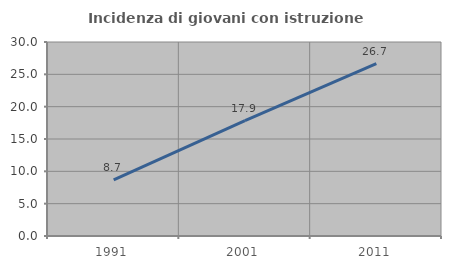
| Category | Incidenza di giovani con istruzione universitaria |
|---|---|
| 1991.0 | 8.696 |
| 2001.0 | 17.857 |
| 2011.0 | 26.667 |